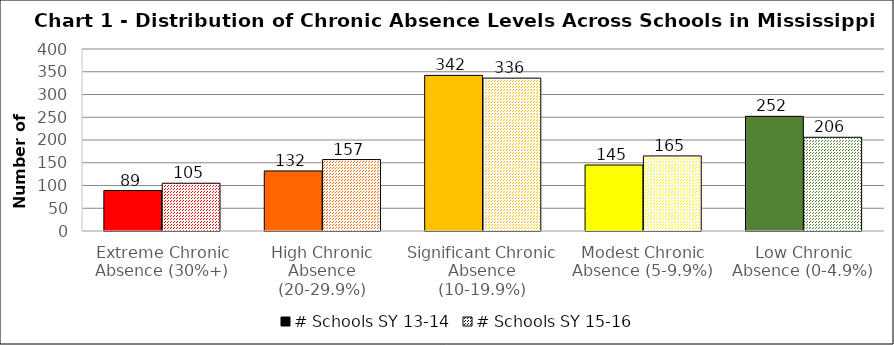
| Category | # Schools SY 13-14 | # Schools SY 15-16 |
|---|---|---|
| Extreme Chronic Absence (30%+) | 89 | 105 |
| High Chronic Absence (20-29.9%) | 132 | 157 |
| Significant Chronic Absence (10-19.9%) | 342 | 336 |
| Modest Chronic Absence (5-9.9%) | 145 | 165 |
| Low Chronic Absence (0-4.9%) | 252 | 206 |